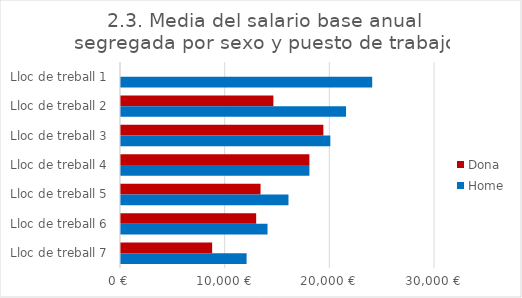
| Category | Dona | Home |
|---|---|---|
| Lloc de treball 1 | 0 | 24000 |
| Lloc de treball 2 | 14559 | 21500 |
| Lloc de treball 3 | 19334 | 20000 |
| Lloc de treball 4 | 18000 | 18000 |
| Lloc de treball 5 | 13333.333 | 16000 |
| Lloc de treball 6 | 12915.395 | 14000 |
| Lloc de treball 7 | 8708.5 | 12000 |